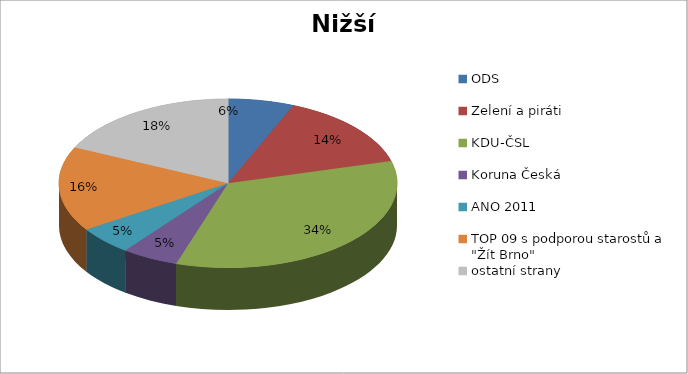
| Category | Series 0 |
|---|---|
| ODS | 7 |
| Zelení a piráti | 16 |
| KDU-ČSL | 38 |
| Koruna Česká | 6 |
| ANO 2011 | 6 |
| TOP 09 s podporou starostů a "Žít Brno" | 18 |
| ostatní strany | 20 |